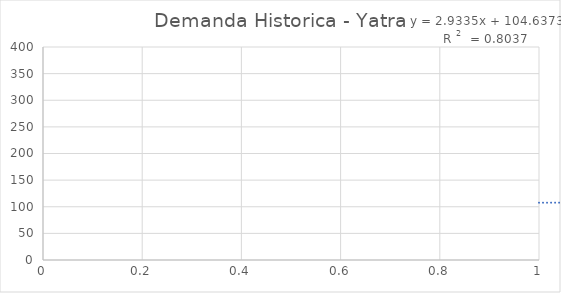
| Category | Series 0 |
|---|---|
| 0 | 84 |
| 1 | 106 |
| 2 | 115 |
| 3 | 113 |
| 4 | 144 |
| 5 | 131 |
| 6 | 127 |
| 7 | 133 |
| 8 | 139 |
| 9 | 97 |
| 10 | 135 |
| 11 | 121 |
| 12 | 94 |
| 13 | 131 |
| 14 | 146 |
| 15 | 144 |
| 16 | 166 |
| 17 | 160 |
| 18 | 177 |
| 19 | 225 |
| 20 | 139 |
| 21 | 237 |
| 22 | 169 |
| 23 | 226 |
| 24 | 139 |
| 25 | 129 |
| 26 | 196 |
| 27 | 164 |
| 28 | 146 |
| 29 | 194 |
| 30 | 170 |
| 31 | 197 |
| 32 | 233 |
| 33 | 245 |
| 34 | 257 |
| 35 | 230 |
| 36 | 244 |
| 37 | 240 |
| 38 | 212 |
| 39 | 228 |
| 40 | 219 |
| 41 | 248 |
| 42 | 241 |
| 43 | 241 |
| 44 | 264 |
| 45 | 248 |
| 46 | 278 |
| 47 | 235 |
| 48 | 255 |
| 49 | 248 |
| 50 | 273 |
| 51 | 252 |
| 52 | 227 |
| 53 | 255 |
| 54 | 262 |
| 55 | 257 |
| 56 | 221 |
| 57 | 220 |
| 58 | 227 |
| 59 | 211 |
| 60 | 236 |
| 61 | 222 |
| 62 | 265 |
| 63 | 271 |
| 64 | 321 |
| 65 | 321 |
| 66 | 330 |
| 67 | 352 |
| 68 | 330 |
| 69 | 332 |
| 70 | 339 |
| 71 | 359 |